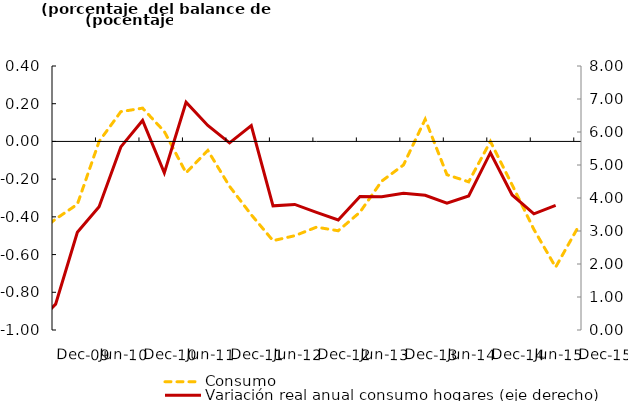
| Category | Consumo  |
|---|---|
| 2008-03-01 | 0 |
| 2008-07-01 | -0.357 |
| 2008-10-01 | -0.786 |
| 2008-12-01 | -0.8 |
| 2009-03-01 | -0.778 |
| 2009-06-01 | -0.526 |
| 2009-09-01 | -0.5 |
| 2009-12-01 | -0.412 |
| 2010-03-01 | -0.333 |
| 2010-06-01 | 0 |
| 2010-09-01 | 0.158 |
| 2010-12-01 | 0.176 |
| 2011-03-01 | 0.053 |
| 2011-06-01 | -0.167 |
| 2011-09-01 | -0.048 |
| 2011-12-01 | -0.238 |
| 2012-03-01 | -0.389 |
| 2012-06-01 | -0.526 |
| 2012-09-01 | -0.5 |
| 2012-12-01 | -0.455 |
| 2013-03-01 | -0.474 |
| 2013-06-01 | -0.375 |
| 2013-09-01 | -0.211 |
| 2013-12-01 | -0.125 |
| 2014-03-01 | 0.118 |
| 2014-06-01 | -0.176 |
| 2014-09-01 | -0.214 |
| 2014-12-01 | 0 |
| 2015-03-01 | -0.231 |
| 2015-06-01 | -0.467 |
| 2015-09-01 | -0.667 |
| 2015-12-01 | -0.462 |